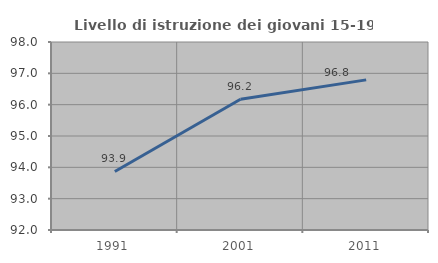
| Category | Livello di istruzione dei giovani 15-19 anni |
|---|---|
| 1991.0 | 93.868 |
| 2001.0 | 96.175 |
| 2011.0 | 96.791 |